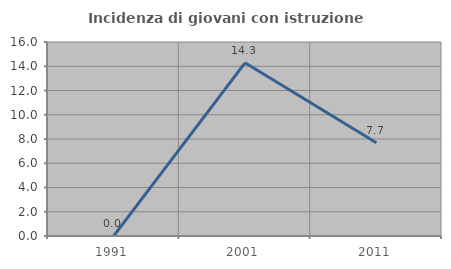
| Category | Incidenza di giovani con istruzione universitaria |
|---|---|
| 1991.0 | 0 |
| 2001.0 | 14.286 |
| 2011.0 | 7.692 |